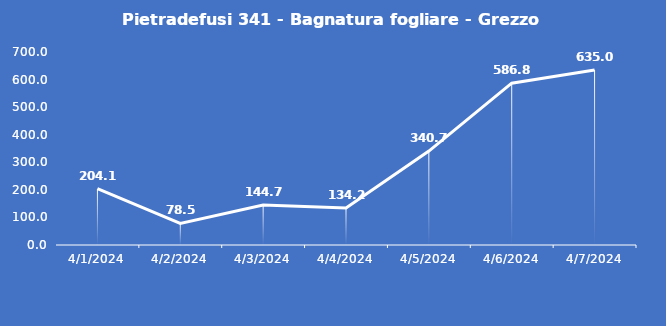
| Category | Pietradefusi 341 - Bagnatura fogliare - Grezzo (min) |
|---|---|
| 4/1/24 | 204.1 |
| 4/2/24 | 78.5 |
| 4/3/24 | 144.7 |
| 4/4/24 | 134.2 |
| 4/5/24 | 340.7 |
| 4/6/24 | 586.8 |
| 4/7/24 | 635 |